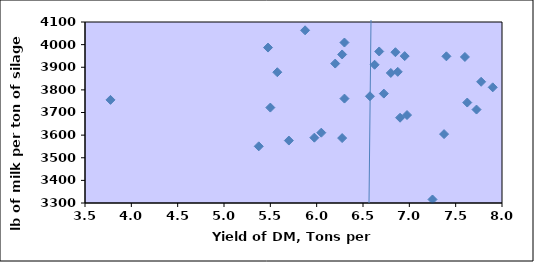
| Category | Series 0 |
|---|---|
| 7.6 | 3945.5 |
| 5.7 | 3576 |
| 7.625 | 3744 |
| 6.875 | 3879.75 |
| 6.975 | 3688.75 |
| 6.275 | 3956.5 |
| 6.9 | 3677 |
| 7.775 | 3835.75 |
| 6.85 | 3966.5 |
| 5.575 | 3878 |
| 5.875 | 4063.25 |
| 7.9 | 3811.25 |
| 7.25 | 3315.5 |
| 7.725 | 3713 |
| 6.3 | 4009.25 |
| 6.95 | 3949.25 |
| 5.975 | 3588.75 |
| 7.4 | 3948.25 |
| 6.725 | 3783.5 |
| 7.375 | 3604.5 |
| 6.275 | 3587 |
| 5.375 | 3550.5 |
| 6.05 | 3610.75 |
| 6.3 | 3761.5 |
| 6.8 | 3874.75 |
| 6.2 | 3916.25 |
| 6.625 | 3911 |
| 3.775 | 3755.75 |
| 5.475 | 3987 |
| 5.5 | 3721.75 |
| 6.675 | 3969.75 |
| 6.575 | 3771.75 |